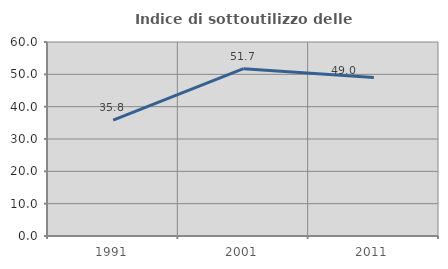
| Category | Indice di sottoutilizzo delle abitazioni  |
|---|---|
| 1991.0 | 35.825 |
| 2001.0 | 51.742 |
| 2011.0 | 49.049 |